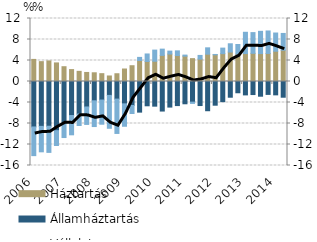
| Category | Háztartás | Államháztartás | Vállalat |
|---|---|---|---|
| 2006.0 | 4.208 | -8.658 | -5.463 |
| 2006.0 | 3.781 | -8.545 | -4.849 |
| 2006.0 | 3.917 | -8.521 | -4.982 |
| 2006.0 | 3.54 | -9.359 | -2.826 |
| 2007.0 | 2.818 | -7.892 | -2.781 |
| 2007.0 | 2.268 | -6.481 | -3.674 |
| 2007.0 | 1.934 | -6.199 | -2.181 |
| 2007.0 | 1.722 | -4.85 | -3.326 |
| 2008.0 | 1.66 | -3.677 | -4.904 |
| 2008.0 | 1.492 | -3.529 | -4.606 |
| 2008.0 | 1.05 | -2.648 | -6.262 |
| 2008.0 | 1.478 | -3.35 | -6.544 |
| 2009.0 | 2.381 | -4.258 | -4.267 |
| 2009.0 | 3.006 | -4.575 | -1.524 |
| 2009.0 | 3.997 | -5.836 | 0.596 |
| 2009.0 | 3.816 | -4.626 | 1.429 |
| 2010.0 | 3.852 | -4.697 | 2.128 |
| 2010.0 | 4.975 | -5.628 | 1.189 |
| 2010.0 | 5.235 | -4.872 | 0.551 |
| 2010.0 | 4.955 | -4.586 | 0.881 |
| 2011.0 | 4.83 | -4.244 | 0.198 |
| 2011.0 | 4.352 | -3.927 | -0.245 |
| 2011.0 | 4.264 | -4.579 | 0.705 |
| 2011.0 | 5.204 | -5.567 | 1.21 |
| 2012.0 | 5.086 | -4.515 | 0.063 |
| 2012.0 | 5.305 | -3.837 | 1.055 |
| 2012.0 | 5.612 | -2.995 | 1.573 |
| 2012.0 | 5.207 | -2.146 | 1.845 |
| 2013.0 | 5.32 | -2.551 | 4.056 |
| 2013.0 | 5.366 | -2.487 | 3.948 |
| 2013.0 | 5.319 | -2.801 | 4.238 |
| 2013.0 | 5.344 | -2.459 | 4.28 |
| 2014.0 | 5.764 | -2.543 | 3.472 |
| 2014.0 | 5.956 | -2.993 | 3.197 |